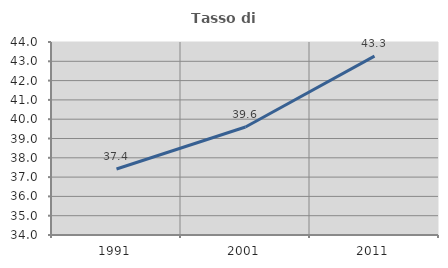
| Category | Tasso di occupazione   |
|---|---|
| 1991.0 | 37.422 |
| 2001.0 | 39.596 |
| 2011.0 | 43.27 |